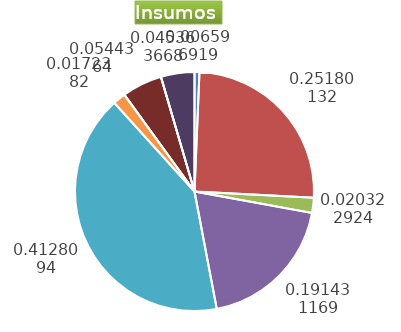
| Category | Series 0 |
|---|---|
| Control arvenses | 815940 |
| Control fitosanitario | 31144050 |
| Cosecha y beneficio | 2513641.199 |
| Fertilización | 23677167 |
| Instalación | 51058336.851 |
| Otros | 2132107 |
| Podas | 0 |
| Riego | 6732967 |
| Transporte | 0 |
| Tutorado | 5610806 |